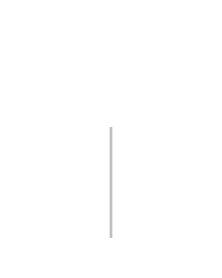
| Category | Pozitív | Negatív |
|---|---|---|
| 0 | 0 | 0 |
| 1 | 428736 | 0 |
| 2 | 428736 | -428736 |